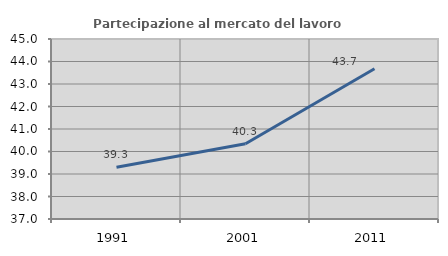
| Category | Partecipazione al mercato del lavoro  femminile |
|---|---|
| 1991.0 | 39.303 |
| 2001.0 | 40.345 |
| 2011.0 | 43.675 |